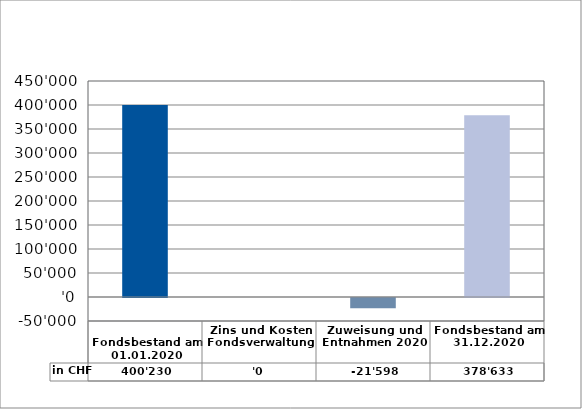
| Category | in CHF |
|---|---|
| 
Fondsbestand am 01.01.2020

 | 400230.05 |
| Zins und Kosten Fondsverwaltung | 0 |
| Zuweisung und Entnahmen 2020 | -21597.55 |
| Fondsbestand am 31.12.2020 | 378632.5 |